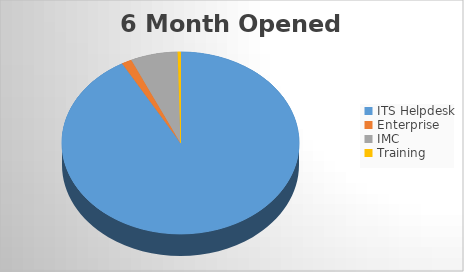
| Category | 6M Opened |
|---|---|
| ITS Helpdesk | 2580 |
| Enterprise | 39 |
| IMC | 180 |
| Training | 11 |